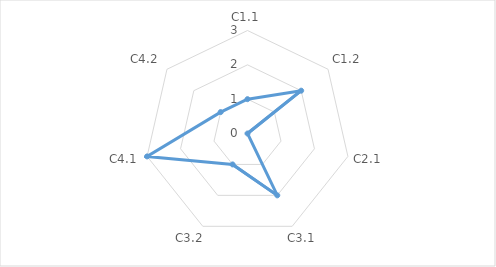
| Category | Series 0 | "" | 1 | 2 | 3 | 4 |
|---|---|---|---|---|---|---|
| C1.1 | 1 |  |  |  |  |  |
| C1.2 | 2 |  |  |  |  |  |
| C2.1 | 0 |  |  |  |  |  |
| C3.1 | 2 |  |  |  |  |  |
| C3.2 | 1 |  |  |  |  |  |
| C4.1 | 3 |  |  |  |  |  |
| C4.2 | 1 |  |  |  |  |  |